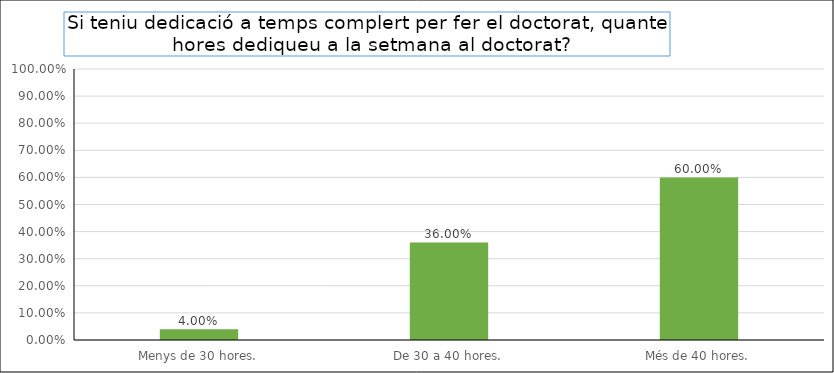
| Category | Series 0 |
|---|---|
| Menys de 30 hores. | 0.04 |
| De 30 a 40 hores. | 0.36 |
| Més de 40 hores. | 0.6 |